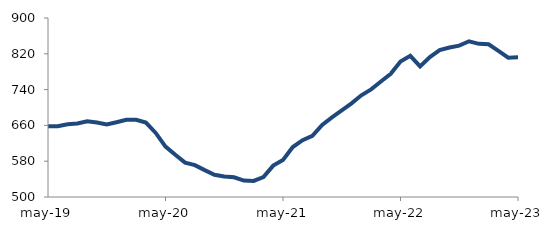
| Category | Series 0 |
|---|---|
| 2019-05-01 | 658.035 |
| 2019-06-01 | 657.952 |
| 2019-07-01 | 662.49 |
| 2019-08-01 | 664.104 |
| 2019-09-01 | 669.196 |
| 2019-10-01 | 666.5 |
| 2019-11-01 | 662.174 |
| 2019-12-01 | 667.143 |
| 2020-01-01 | 672.455 |
| 2020-02-01 | 672.659 |
| 2020-03-01 | 666.213 |
| 2020-04-01 | 643.145 |
| 2020-05-01 | 612.572 |
| 2020-06-01 | 594.292 |
| 2020-07-01 | 576.858 |
| 2020-08-01 | 571.224 |
| 2020-09-01 | 560.032 |
| 2020-10-01 | 549.541 |
| 2020-11-01 | 545.982 |
| 2020-12-01 | 544.038 |
| 2021-01-01 | 536.772 |
| 2021-02-01 | 535.938 |
| 2021-03-01 | 544.717 |
| 2021-04-01 | 570.16 |
| 2021-05-01 | 582.981 |
| 2021-06-01 | 611.684 |
| 2021-07-01 | 627.037 |
| 2021-08-01 | 636.642 |
| 2021-09-01 | 661.114 |
| 2021-10-01 | 677.889 |
| 2021-11-01 | 693.389 |
| 2021-12-01 | 709.343 |
| 2022-01-01 | 727.31 |
| 2022-02-01 | 740.539 |
| 2022-03-01 | 758.027 |
| 2022-04-01 | 775.241 |
| 2022-05-01 | 802.956 |
| 2022-06-01 | 815.434 |
| 2022-07-01 | 791.89 |
| 2022-08-01 | 812.76 |
| 2022-09-01 | 828.12 |
| 2022-10-01 | 834 |
| 2022-11-01 | 838.178 |
| 2022-12-01 | 847.954 |
| 2023-01-01 | 842.285 |
| 2023-02-01 | 841.25 |
| 2023-03-01 | 826.38 |
| 2023-04-01 | 811.394 |
| 2023-05-01 | 812.228 |